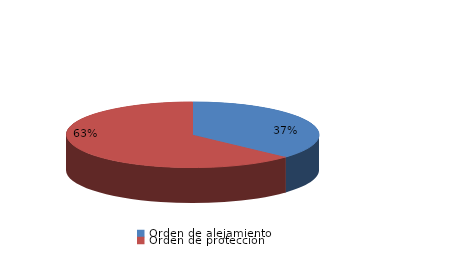
| Category | Series 0 |
|---|---|
| Orden de alejamiento | 21 |
| Orden de protección | 36 |